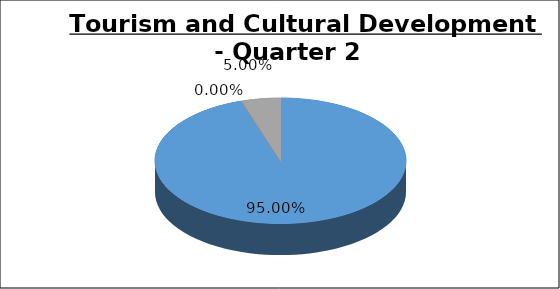
| Category | Q2 |
|---|---|
| Green | 0.95 |
| Amber | 0 |
| Red | 0.05 |